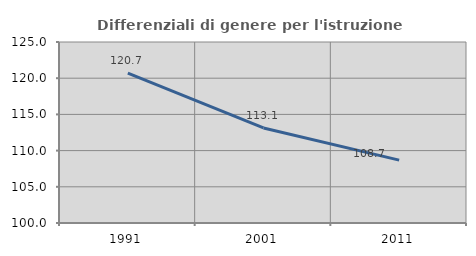
| Category | Differenziali di genere per l'istruzione superiore |
|---|---|
| 1991.0 | 120.715 |
| 2001.0 | 113.128 |
| 2011.0 | 108.68 |